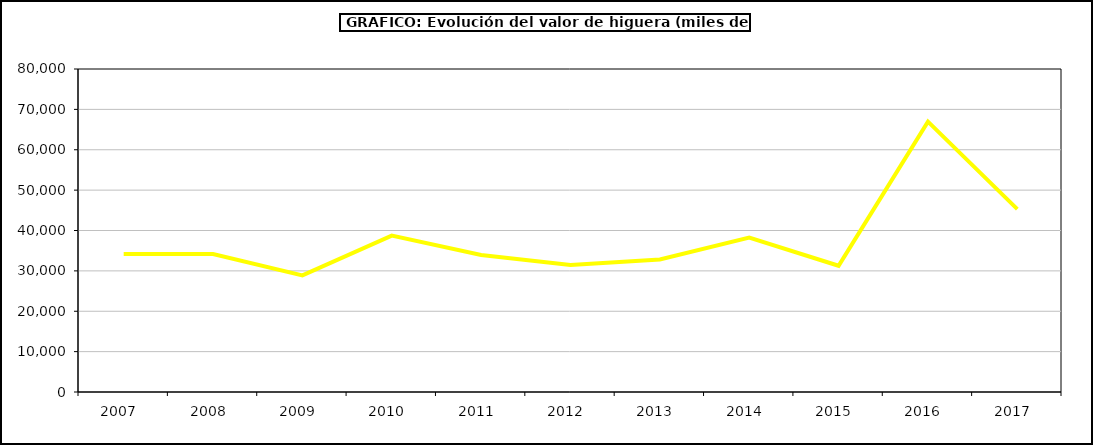
| Category | valor higuera |
|---|---|
| 2007.0 | 34159.652 |
| 2008.0 | 34191.335 |
| 2009.0 | 28875.392 |
| 2010.0 | 38741.248 |
| 2011.0 | 33937.485 |
| 2012.0 | 31478.992 |
| 2013.0 | 32844.373 |
| 2014.0 | 38257.221 |
| 2015.0 | 31266 |
| 2016.0 | 66968 |
| 2017.0 | 45296.738 |